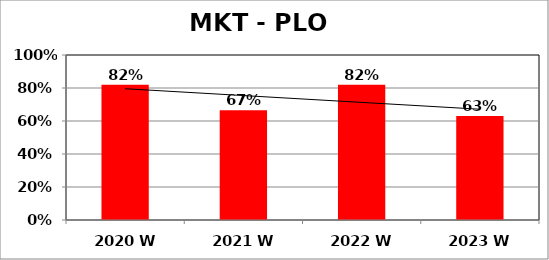
| Category | Series 0 |
|---|---|
| 2020 W | 0.82 |
| 2021 W | 0.665 |
| 2022 W | 0.82 |
| 2023 W | 0.63 |